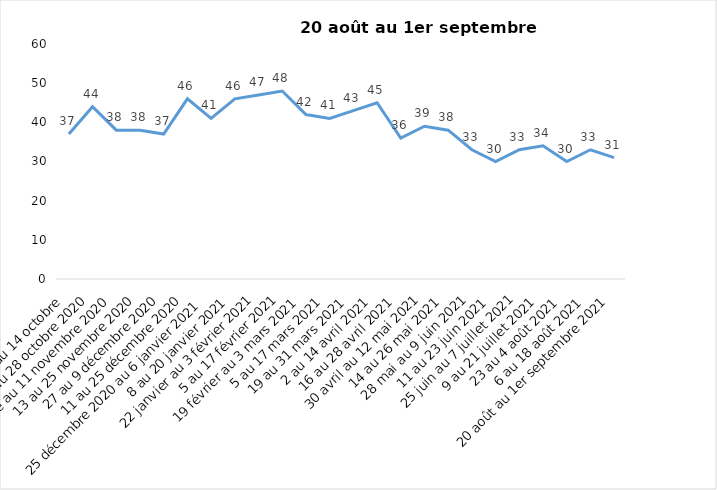
| Category | Toujours aux trois mesures |
|---|---|
| 2 au 14 octobre  | 37 |
| 16 au 28 octobre 2020 | 44 |
| 30 octobre au 11 novembre 2020 | 38 |
| 13 au 25 novembre 2020 | 38 |
| 27 au 9 décembre 2020 | 37 |
| 11 au 25 décembre 2020 | 46 |
| 25 décembre 2020 au 6 janvier 2021 | 41 |
| 8 au 20 janvier 2021 | 46 |
| 22 janvier au 3 février 2021 | 47 |
| 5 au 17 février 2021 | 48 |
| 19 février au 3 mars 2021 | 42 |
| 5 au 17 mars 2021 | 41 |
| 19 au 31 mars 2021 | 43 |
| 2 au 14 avril 2021 | 45 |
| 16 au 28 avril 2021 | 36 |
| 30 avril au 12 mai 2021 | 39 |
| 14 au 26 mai 2021 | 38 |
| 28 mai au 9 juin 2021 | 33 |
| 11 au 23 juin 2021 | 30 |
| 25 juin au 7 juillet 2021 | 33 |
| 9 au 21 juillet 2021 | 34 |
| 23 au 4 août 2021 | 30 |
| 6 au 18 août 2021 | 33 |
| 20 août au 1er septembre 2021 | 31 |